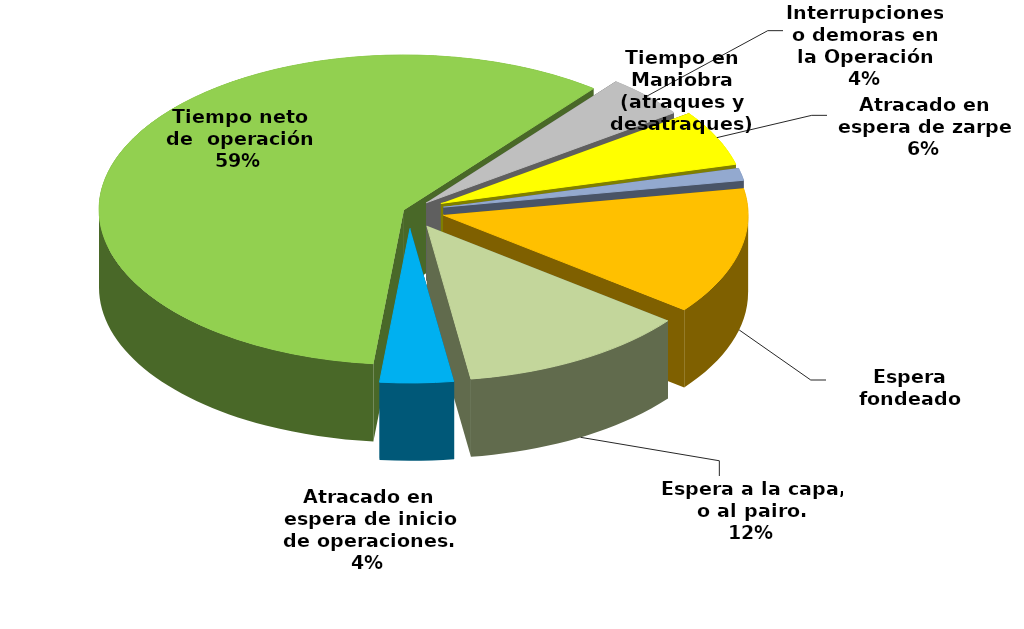
| Category | Series 0 |
|---|---|
| Espera fondeado | 2741.333 |
| Espera a la capa, o al pairo. | 2521.4 |
| Atracado en espera de inicio de operaciones. | 806.517 |
| Tiempo neto de  operación | 12206.907 |
| Interrupciones o demoras en la Operación | 914.64 |
| Atracado en espera de zarpe | 1202.796 |
| Tiempo en Maniobra (atraques y desatraques) | 268.35 |